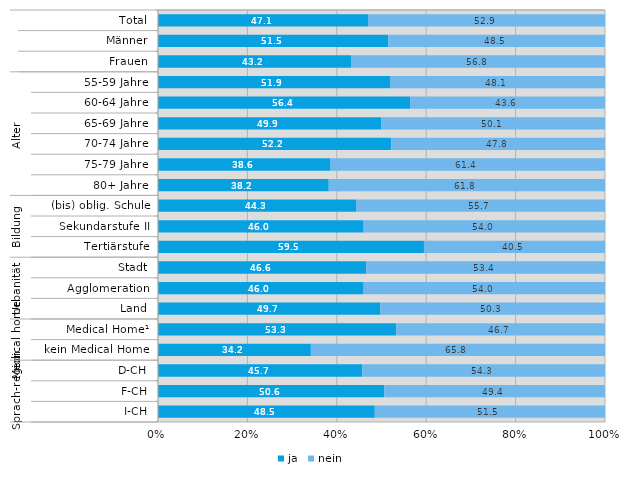
| Category | ja | nein |
|---|---|---|
| 0 | 47.1 | 52.9 |
| 1 | 51.5 | 48.5 |
| 2 | 43.2 | 56.8 |
| 3 | 51.9 | 48.1 |
| 4 | 56.4 | 43.6 |
| 5 | 49.9 | 50.1 |
| 6 | 52.2 | 47.8 |
| 7 | 38.6 | 61.4 |
| 8 | 38.2 | 61.8 |
| 9 | 44.3 | 55.7 |
| 10 | 46 | 54 |
| 11 | 59.5 | 40.5 |
| 12 | 46.6 | 53.4 |
| 13 | 46 | 54 |
| 14 | 49.7 | 50.3 |
| 15 | 53.3 | 46.7 |
| 16 | 34.2 | 65.8 |
| 17 | 45.7 | 54.3 |
| 18 | 50.6 | 49.4 |
| 19 | 48.5 | 51.5 |